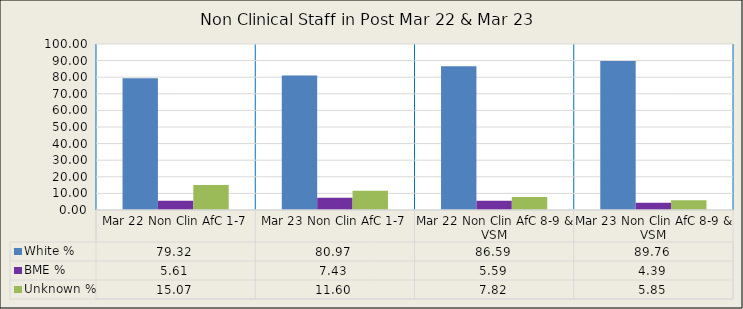
| Category | White % | BME % | Unknown % |
|---|---|---|---|
| Mar 22 Non Clin AfC 1-7 | 79.318 | 5.611 | 15.072 |
| Mar 23 Non Clin AfC 1-7 | 80.971 | 7.433 | 11.596 |
| Mar 22 Non Clin AfC 8-9 & VSM | 86.592 | 5.587 | 7.821 |
| Mar 23 Non Clin AfC 8-9 & VSM | 89.756 | 4.39 | 5.854 |